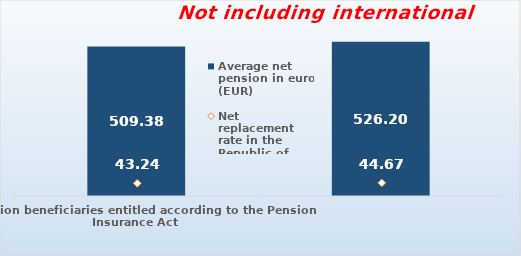
| Category | Average net pension in euros (EUR)  |
|---|---|
| Pension beneficiaries entitled according to the Pension Insurance Act   | 509.38 |
| Pension beneficiaries entitled to pension FOR THE FIRST TIME in 2023 according to the Pension Insurance Act  - NEW BENEFICIARIES | 526.202 |